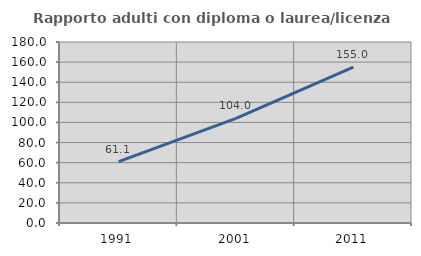
| Category | Rapporto adulti con diploma o laurea/licenza media  |
|---|---|
| 1991.0 | 61.111 |
| 2001.0 | 104 |
| 2011.0 | 155 |